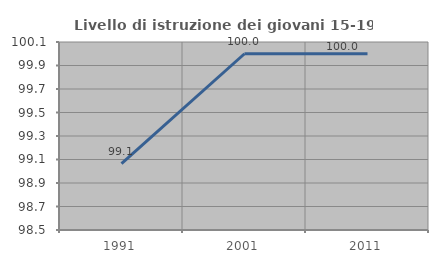
| Category | Livello di istruzione dei giovani 15-19 anni |
|---|---|
| 1991.0 | 99.065 |
| 2001.0 | 100 |
| 2011.0 | 100 |